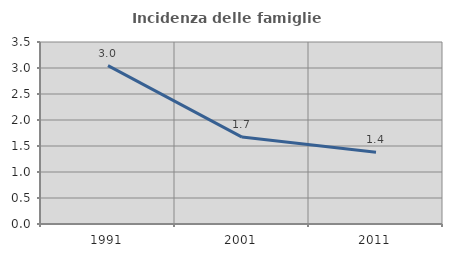
| Category | Incidenza delle famiglie numerose |
|---|---|
| 1991.0 | 3.046 |
| 2001.0 | 1.672 |
| 2011.0 | 1.381 |